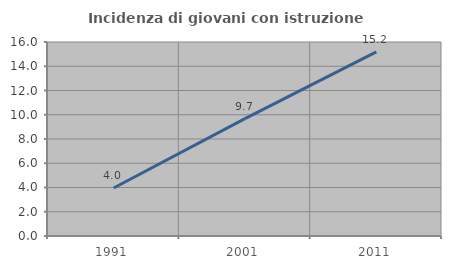
| Category | Incidenza di giovani con istruzione universitaria |
|---|---|
| 1991.0 | 3.955 |
| 2001.0 | 9.677 |
| 2011.0 | 15.185 |